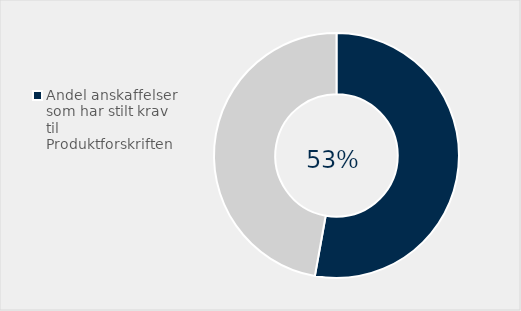
| Category | Series 0 |
|---|---|
| Andel anskaffelser som har stilt krav til Produktforskriften | 0.528 |
| Ikke brukt  | 0.472 |